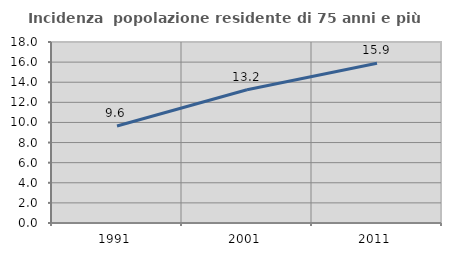
| Category | Incidenza  popolazione residente di 75 anni e più |
|---|---|
| 1991.0 | 9.647 |
| 2001.0 | 13.245 |
| 2011.0 | 15.892 |